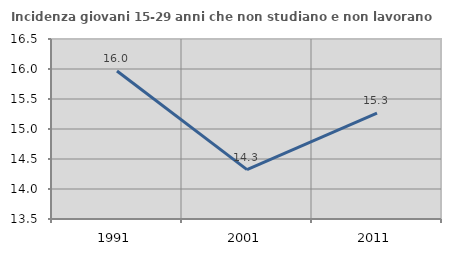
| Category | Incidenza giovani 15-29 anni che non studiano e non lavorano  |
|---|---|
| 1991.0 | 15.966 |
| 2001.0 | 14.322 |
| 2011.0 | 15.263 |